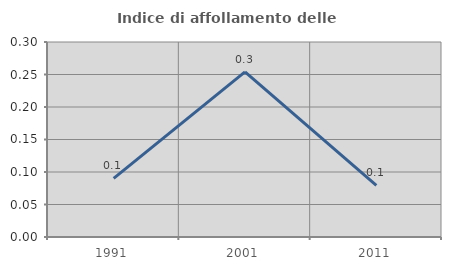
| Category | Indice di affollamento delle abitazioni  |
|---|---|
| 1991.0 | 0.09 |
| 2001.0 | 0.254 |
| 2011.0 | 0.079 |